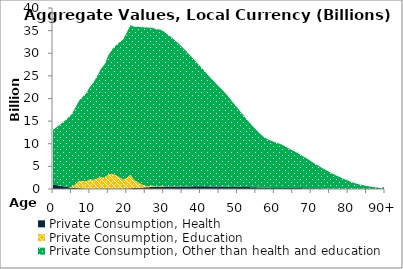
| Category | Private Consumption, Health | Private Consumption, Education | Private Consumption, Other than health and education |
|---|---|---|---|
| 0 | 996.566 | 0 | 12064.384 |
|  | 848.248 | 0 | 12835.682 |
| 2 | 704.973 | 0 | 13614.201 |
| 3 | 565.724 | 0 | 14403.41 |
| 4 | 429.587 | 0 | 15206.092 |
| 5 | 288.235 | 159.078 | 16024.379 |
| 6 | 226.614 | 775.097 | 16859.704 |
| 7 | 176.229 | 1569.126 | 17712.821 |
| 8 | 127.152 | 1644.815 | 18583.808 |
| 9 | 78.126 | 1637.125 | 19472.069 |
| 10 | 75.299 | 2071.966 | 20419.934 |
| 11 | 79.043 | 1952.504 | 21545.966 |
| 12 | 80.396 | 2259.359 | 22678.014 |
| 13 | 83.566 | 2595.043 | 23873.84 |
| 14 | 84.776 | 2375.183 | 25109.729 |
| 15 | 87.188 | 3168.227 | 26274.363 |
| 16 | 94.741 | 3281.41 | 27445.729 |
| 17 | 99.286 | 2952.009 | 28663.54 |
| 18 | 104.121 | 2517.022 | 29786.222 |
| 19 | 110.674 | 1984.348 | 30960.435 |
| 20 | 115.773 | 2343.842 | 32134.223 |
| 21 | 174.455 | 2968.975 | 33061.795 |
| 22 | 218.171 | 1798.58 | 33846.393 |
| 23 | 266.614 | 1234.68 | 34364 |
| 24 | 316.697 | 706.124 | 34711.783 |
| 25 | 366.943 | 343.152 | 34999.237 |
| 26 | 405.225 | 251.751 | 35011.59 |
| 27 | 450.532 | 289.356 | 34859.879 |
| 28 | 485.495 | 48.269 | 34788.486 |
| 29 | 522.069 | 124.249 | 34605.362 |
| 30 | 522.571 | 99.885 | 34195.163 |
| 31 | 552.128 | 18.122 | 33619.573 |
| 32 | 550.553 | 68.737 | 33002.195 |
| 33 | 549.821 | 26.498 | 32317.196 |
| 34 | 544.185 | 62.284 | 31600.487 |
| 35 | 552.458 | 0 | 30846.101 |
| 36 | 564.666 | 0 | 29990.939 |
| 37 | 573.562 | 0 | 29116.289 |
| 38 | 581.103 | 0 | 28260.648 |
| 39 | 584.798 | 0 | 27310.124 |
| 40 | 612.165 | 0 | 26447.226 |
| 41 | 588.516 | 0 | 25556.075 |
| 42 | 580.173 | 0 | 24631.207 |
| 43 | 573.754 | 0 | 23743.335 |
| 44 | 552.157 | 0 | 22921.706 |
| 45 | 536.442 | 0 | 22072.686 |
| 46 | 525.37 | 0 | 21301.236 |
| 47 | 514.044 | 0 | 20411.696 |
| 48 | 488.989 | 0 | 19453.809 |
| 49 | 441.467 | 0 | 18434.959 |
| 50 | 505.366 | 0 | 17455.925 |
| 51 | 476.178 | 0 | 16432.802 |
| 52 | 446.975 | 0 | 15451.808 |
| 53 | 426.608 | 0 | 14499.938 |
| 54 | 394.258 | 0 | 13623.796 |
| 55 | 365.653 | 0 | 12758.722 |
| 56 | 336.11 | 0 | 11965.073 |
| 57 | 329.476 | 0 | 11272.084 |
| 58 | 307.732 | 0 | 10769.07 |
| 59 | 245.297 | 0 | 10456.349 |
| 60 | 238.718 | 0 | 10149.969 |
| 61 | 235.171 | 0 | 9896.4 |
| 62 | 231.198 | 0 | 9590.202 |
| 63 | 230.707 | 0 | 9167.775 |
| 64 | 221.247 | 0 | 8731.112 |
| 65 | 213.449 | 0 | 8277.434 |
| 66 | 201.999 | 0 | 7884.702 |
| 67 | 201.601 | 0 | 7439.404 |
| 68 | 187.277 | 0 | 6947.386 |
| 69 | 184.039 | 0 | 6448.076 |
| 70 | 172.822 | 0 | 5944.46 |
| 71 | 160.126 | 0 | 5453.672 |
| 72 | 148.487 | 0 | 4968.942 |
| 73 | 138.673 | 0 | 4486.964 |
| 74 | 128.123 | 0 | 4055.458 |
| 75 | 114.343 | 0 | 3623.106 |
| 76 | 99.175 | 0 | 3206.195 |
| 77 | 90.522 | 0 | 2819.349 |
| 78 | 72.754 | 0 | 2455.717 |
| 79 | 61.626 | 0 | 2123.469 |
| 80 | 56.33 | 0 | 1789.777 |
| 81 | 45.692 | 0 | 1472.266 |
| 82 | 38.536 | 0 | 1202.755 |
| 83 | 33.575 | 0 | 986.466 |
| 84 | 28.749 | 0 | 812.039 |
| 85 | 22.917 | 0 | 653.861 |
| 86 | 16.513 | 0 | 514.543 |
| 87 | 13.032 | 0 | 397.829 |
| 88 | 10.1 | 0 | 302.18 |
| 89 | 7.677 | 0 | 225.177 |
| 90+ | 17.636 | 0 | 507.307 |